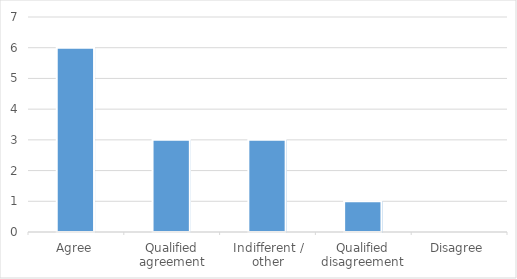
| Category | Series 0 |
|---|---|
| Agree | 6 |
| Qualified agreement | 3 |
| Indifferent / other | 3 |
| Qualified disagreement | 1 |
| Disagree | 0 |